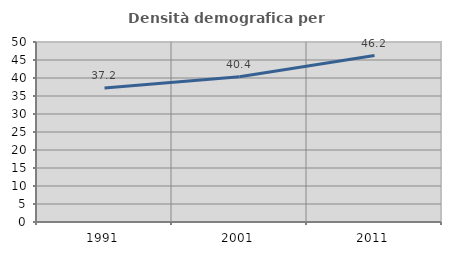
| Category | Densità demografica |
|---|---|
| 1991.0 | 37.245 |
| 2001.0 | 40.357 |
| 2011.0 | 46.247 |